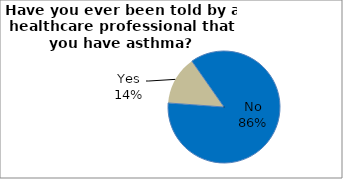
| Category | Series 0 |
|---|---|
| No | 85.871 |
| Yes | 14.129 |